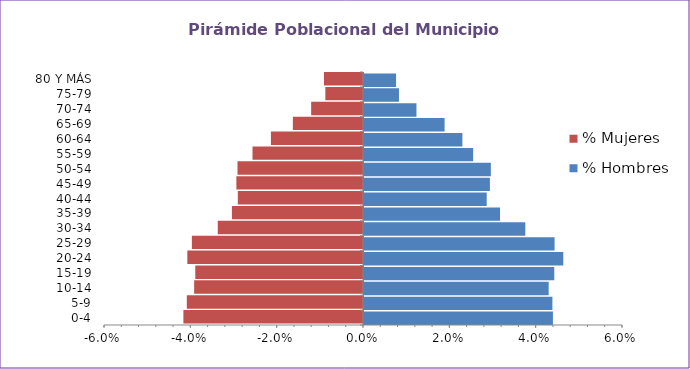
| Category | % Hombres | % Mujeres |
|---|---|---|
| 0-4 | 0.044 | -0.042 |
| 5-9 | 0.044 | -0.041 |
| 10-14 | 0.043 | -0.039 |
| 15-19 | 0.044 | -0.039 |
| 20-24 | 0.046 | -0.041 |
| 25-29 | 0.044 | -0.04 |
| 30-34 | 0.037 | -0.034 |
| 35-39 | 0.032 | -0.03 |
| 40-44 | 0.028 | -0.029 |
| 45-49 | 0.029 | -0.029 |
| 50-54 | 0.029 | -0.029 |
| 55-59 | 0.025 | -0.026 |
| 60-64 | 0.023 | -0.021 |
| 65-69 | 0.019 | -0.016 |
| 70-74 | 0.012 | -0.012 |
| 75-79 | 0.008 | -0.009 |
| 80 Y MÁS | 0.007 | -0.009 |